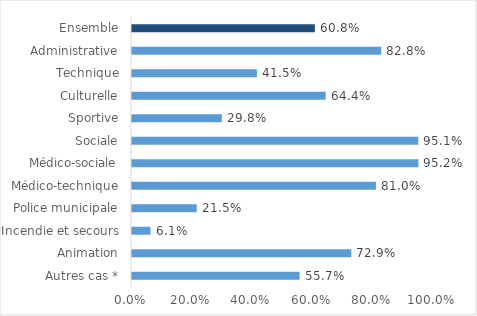
| Category | Taux de féminisation |
|---|---|
| 0 | 0.557 |
| 1 | 0.729 |
| 2 | 0.061 |
| 3 | 0.215 |
| 4 | 0.81 |
| 5 | 0.952 |
| 6 | 0.951 |
| 7 | 0.298 |
| 8 | 0.644 |
| 9 | 0.415 |
| 10 | 0.828 |
| 11 | 0.608 |